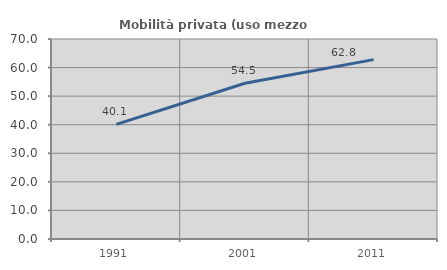
| Category | Mobilità privata (uso mezzo privato) |
|---|---|
| 1991.0 | 40.139 |
| 2001.0 | 54.528 |
| 2011.0 | 62.787 |